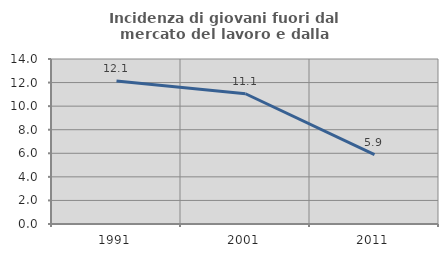
| Category | Incidenza di giovani fuori dal mercato del lavoro e dalla formazione  |
|---|---|
| 1991.0 | 12.143 |
| 2001.0 | 11.053 |
| 2011.0 | 5.882 |